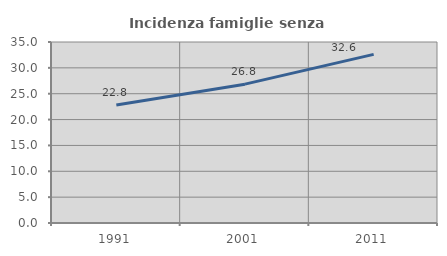
| Category | Incidenza famiglie senza nuclei |
|---|---|
| 1991.0 | 22.811 |
| 2001.0 | 26.847 |
| 2011.0 | 32.612 |